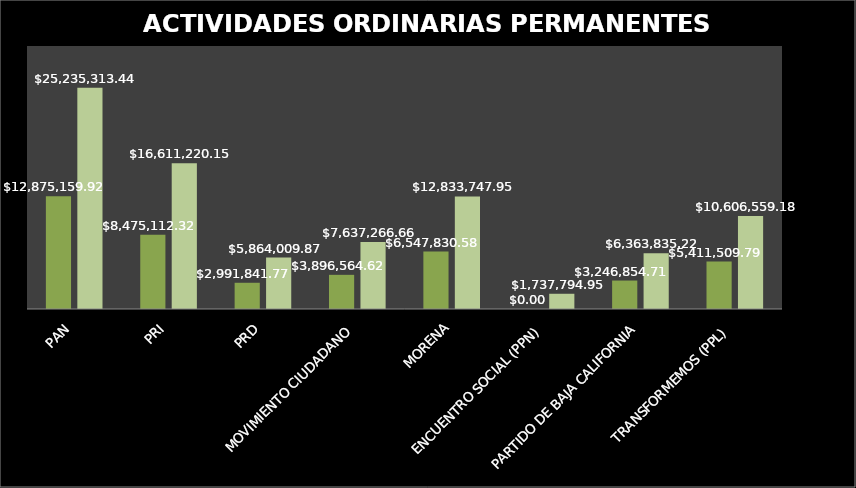
| Category | Series 0 | Series 1 |
|---|---|---|
| PAN | 12875159.92 | 25235313.44 |
| PRI | 8475112.32 | 16611220.15 |
| PRD | 2991841.77 | 5864009.87 |
| MOVIMIENTO CIUDADANO | 3896564.62 | 7637266.66 |
| MORENA | 6547830.58 | 12833747.95 |
| ENCUENTRO SOCIAL (PPN) | 0 | 1737794.95 |
| PARTIDO DE BAJA CALIFORNIA | 3246854.71 | 6363835.22 |
| TRANSFORMEMOS (PPL) | 5411509.79 | 10606559.18 |